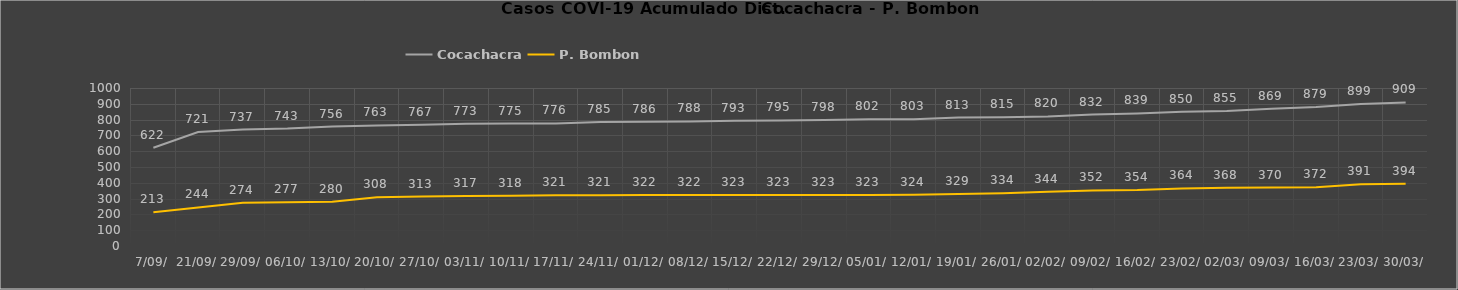
| Category | Cocachacra | P. Bombon |
|---|---|---|
| 7/09/ | 622 | 213 |
| 21/09/ | 721 | 244 |
| 29/09/ | 737 | 274 |
| 06/10/ | 743 | 277 |
| 13/10/ | 756 | 280 |
| 20/10/ | 763 | 308 |
| 27/10/ | 767 | 313 |
| 03/11/ | 773 | 317 |
| 10/11/ | 775 | 318 |
| 17/11/ | 776 | 321 |
| 24/11/ | 785 | 321 |
| 01/12/ | 786 | 322 |
| 08/12/ | 788 | 322 |
| 15/12/ | 793 | 323 |
| 22/12/ | 795 | 323 |
| 29/12/ | 798 | 323 |
| 05/01/ | 802 | 323 |
| 12/01/ | 803 | 324 |
| 19/01/ | 813 | 329 |
| 26/01/ | 815 | 334 |
| 02/02/ | 820 | 344 |
| 09/02/ | 832 | 352 |
| 16/02/ | 839 | 354 |
| 23/02/ | 850 | 364 |
| 02/03/ | 855 | 368 |
| 09/03/ | 869 | 370 |
| 16/03/ | 879 | 372 |
| 23/03/ | 899 | 391 |
| 30/03/ | 909 | 394 |